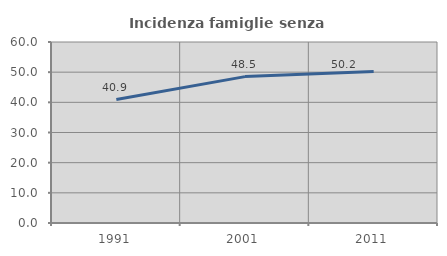
| Category | Incidenza famiglie senza nuclei |
|---|---|
| 1991.0 | 40.909 |
| 2001.0 | 48.526 |
| 2011.0 | 50.209 |